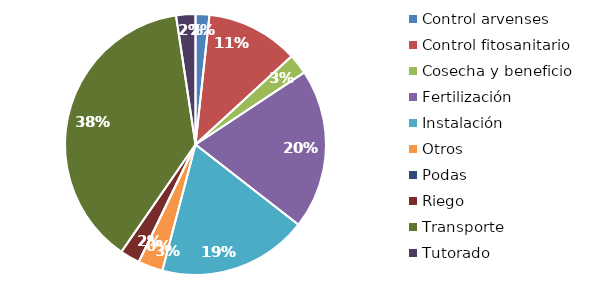
| Category | Valor |
|---|---|
| Control arvenses | 1661140 |
| Control fitosanitario | 11117116 |
| Cosecha y beneficio | 2437621.168 |
| Fertilización | 19238140 |
| Instalación | 17999798.179 |
| Otros | 2971560 |
| Podas | 0 |
| Riego | 2379583 |
| Transporte | 36841940 |
| Tutorado | 2321544 |